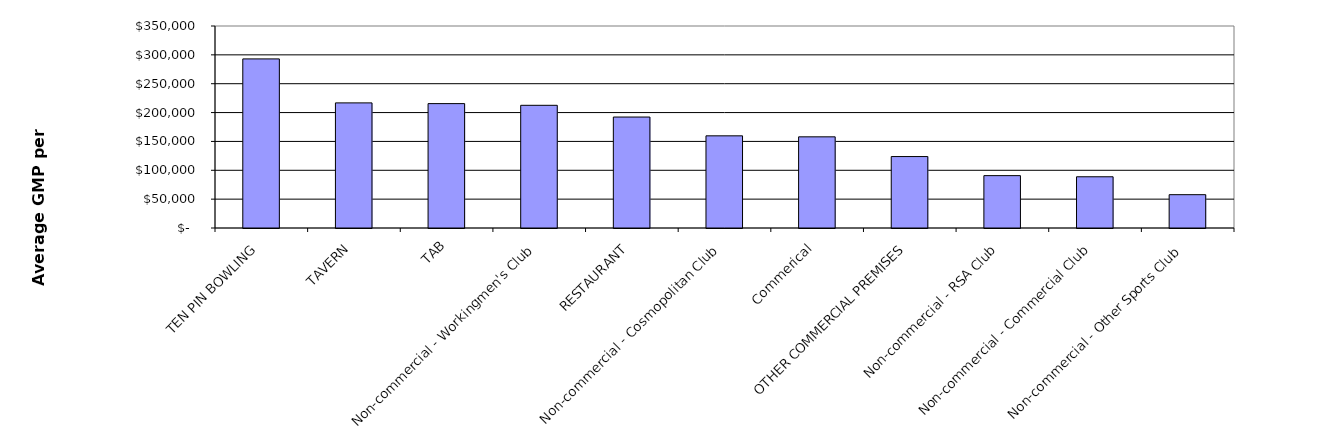
| Category | Series 0 |
|---|---|
| TEN PIN BOWLING | 293010.49 |
| TAVERN | 216792.69 |
| TAB | 215527.304 |
| Non-commercial - Workingmen's Club | 212593.655 |
| RESTAURANT | 192254.177 |
| Non-commercial - Cosmopolitan Club | 159699.756 |
| Commerical | 157946.837 |
| OTHER COMMERCIAL PREMISES | 123779.883 |
| Non-commercial - RSA Club | 90722.868 |
| Non-commercial - Commercial Club | 88751.209 |
| Non-commercial - Other Sports Club | 57731.866 |